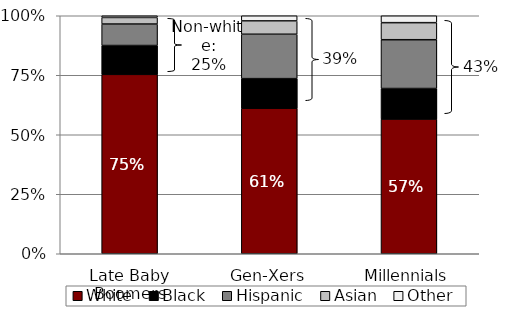
| Category | White | Black | Hispanic | Asian | Other |
|---|---|---|---|---|---|
| Late Baby Boomers | 75.38 | 12.11 | 9.03 | 2.77 | 0.71 |
| Gen-Xers | 61.14 | 12.44 | 18.65 | 5.61 | 2.16 |
| Millennials | 56.59 | 12.83 | 20.51 | 7.17 | 2.9 |